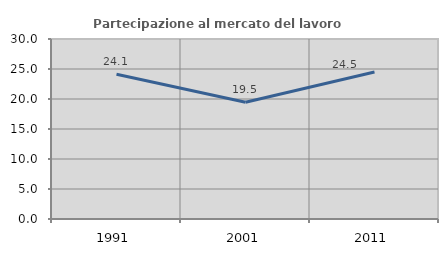
| Category | Partecipazione al mercato del lavoro  femminile |
|---|---|
| 1991.0 | 24.132 |
| 2001.0 | 19.453 |
| 2011.0 | 24.503 |